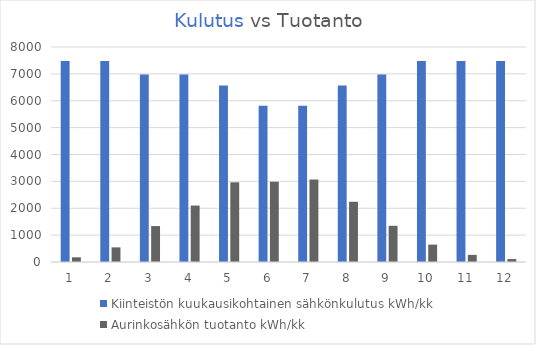
| Category | Kiinteistön kuukausikohtainen sähkönkulutus kWh/kk | Aurinkosähkön tuotanto kWh/kk |
|---|---|---|
| 0 | 7479 | 175.386 |
| 1 | 7479 | 544.544 |
| 2 | 6980.4 | 1337.315 |
| 3 | 6980.4 | 2100.384 |
| 4 | 6564.9 | 2965.113 |
| 5 | 5817 | 2986.152 |
| 6 | 5817 | 3069.248 |
| 7 | 6564.9 | 2241.647 |
| 8 | 6980.4 | 1347.216 |
| 9 | 7479 | 646.734 |
| 10 | 7479 | 265.2 |
| 11 | 7479 | 109.616 |